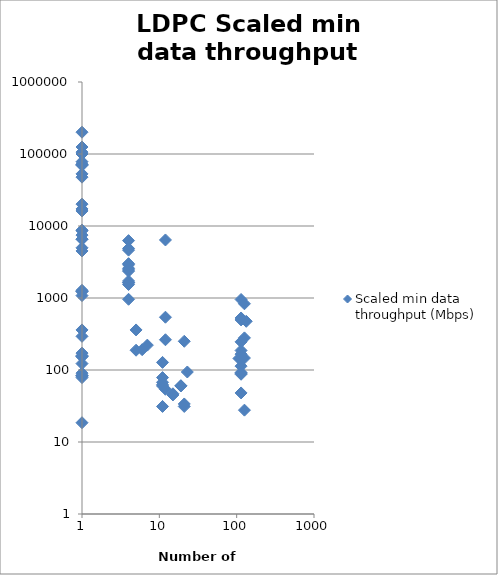
| Category | Scaled min data throughput (Mbps) |
|---|---|
| 107.0 | 144.615 |
| 114.0 | 954 |
| 19.0 | 60 |
| 133.0 | 474.923 |
| 114.0 | 87.266 |
| 7.0 | 221.538 |
| 12.0 | 541 |
| 114.0 | 90 |
| 114.0 | 48 |
| 11.0 | 60 |
| 11.0 | 78.5 |
| 11.0 | 127.5 |
| 21.0 | 31.154 |
| 11.0 | 67.5 |
| 11.0 | 62.308 |
| 5.0 | 360 |
| 21.0 | 33.75 |
| 15.0 | 46.731 |
| 15.0 | 45 |
| 21.0 | 250.615 |
| 11.0 | 31.154 |
| 5.0 | 188.308 |
| 1.0 | 360 |
| 12.0 | 54 |
| 1.0 | 1080 |
| 114.0 | 92.312 |
| 126.0 | 279.25 |
| 126.0 | 146.769 |
| 126.0 | 831.102 |
| 1.0 | 1230.769 |
| 126.0 | 27.7 |
| 1.0 | 293.538 |
| 114.0 | 166 |
| 19.0 | 60.6 |
| 1.0 | 1230.769 |
| 1.0 | 171.662 |
| 1.0 | 153.569 |
| 1.0 | 158.738 |
| 1.0 | 122.769 |
| 1.0 | 153.354 |
| 1.0 | 18.523 |
| 1.0 | 90.462 |
| 1.0 | 83.569 |
| 1.0 | 84.215 |
| 1.0 | 78.4 |
| 1.0 | 82.277 |
| 1.0 | 17246.826 |
| 1.0 | 8581.348 |
| 1.0 | 71407.685 |
| 1.0 | 200826.833 |
| 1.0 | 20124.102 |
| 1.0 | 52909.25 |
| 4.0 | 4877.633 |
| 4.0 | 960 |
| 4.0 | 1630.769 |
| 4.0 | 1630.769 |
| 4.0 | 2360 |
| 4.0 | 2584.615 |
| 1.0 | 69475.264 |
| 4.0 | 2454.722 |
| 1.0 | 125000 |
| 1.0 | 100000 |
| 114.0 | 186.646 |
| 12.0 | 6399.483 |
| 23.0 | 93.818 |
| 114.0 | 246.098 |
| 114.0 | 496 |
| 1.0 | 6530 |
| 1.0 | 8760 |
| 1.0 | 4980 |
| 1.0 | 47700 |
| 1.0 | 16186.154 |
| 6.0 | 191.52 |
| 114.0 | 113.03 |
| 114.0 | 528 |
| 4.0 | 6266.374 |
| 4.0 | 4625 |
| 1.0 | 1280 |
| 12.0 | 263.077 |
| 1.0 | 4500 |
| 4.0 | 1540 |
| 4.0 | 2895 |
| 4.0 | 3000 |
| 1.0 | 6568.333 |
| 1.0 | 7475 |
| 1.0 | 78073.438 |
| 1.0 | 72100.146 |
| 4.0 | 1723.077 |
| 1.0 | 106257.275 |